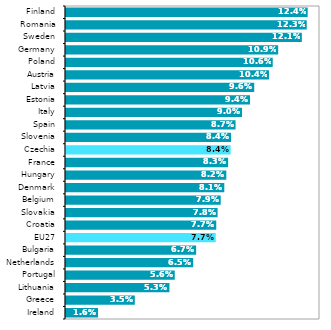
| Category | 2019* |
|---|---|
| Ireland | 0.016 |
| Greece | 0.035 |
| Lithuania | 0.053 |
| Portugal | 0.056 |
| Netherlands | 0.065 |
| Bulgaria | 0.067 |
| EU27 | 0.077 |
| Croatia | 0.077 |
| Slovakia | 0.078 |
| Belgium | 0.079 |
| Denmark | 0.081 |
| Hungary | 0.082 |
| France | 0.083 |
| Czechia | 0.084 |
| Slovenia | 0.084 |
| Spain | 0.087 |
| Italy | 0.09 |
| Estonia | 0.094 |
| Latvia | 0.096 |
| Austria | 0.104 |
| Poland | 0.106 |
| Germany | 0.109 |
| Sweden | 0.121 |
| Romania | 0.123 |
| Finland | 0.124 |